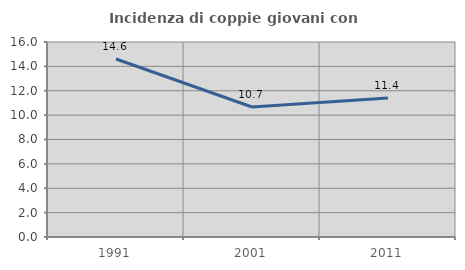
| Category | Incidenza di coppie giovani con figli |
|---|---|
| 1991.0 | 14.605 |
| 2001.0 | 10.664 |
| 2011.0 | 11.406 |